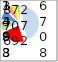
| Category | 8 اشهر 2013 |
|---|---|
| الصناعات الميكانيكية والكهربائية | 6707.5 |
| صناعة النسيج والملابس | 3487.7 |
| الصيناعات الكيميائية | 1492.69 |
| الصناعات الغذائية | 1392.521 |
| الصناعات المختلفة | 875.935 |
| صناعة الجلود والاحذية | 709.2 |
| صناعات مواد البناء والخزف والبلور | 271.72 |